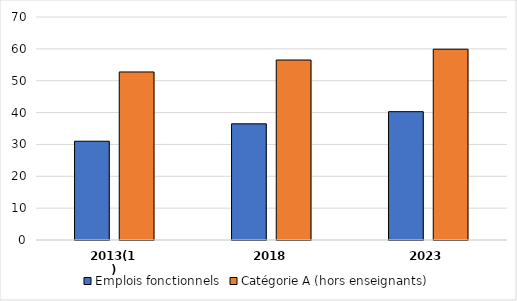
| Category | Emplois fonctionnels | Catégorie A (hors enseignants) |
|---|---|---|
| 2013(1) | 31.004 | 52.749 |
| 2018 | 36.463 | 56.495 |
| 2023 | 40.287 | 59.896 |